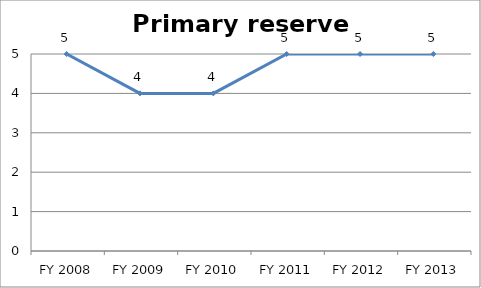
| Category | Primary reserve score |
|---|---|
| FY 2013 | 5 |
| FY 2012 | 5 |
| FY 2011 | 5 |
| FY 2010 | 4 |
| FY 2009 | 4 |
| FY 2008 | 5 |